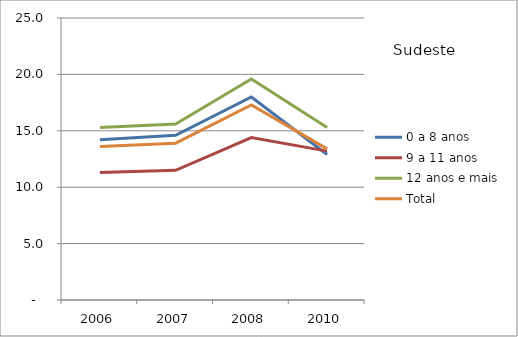
| Category | 0 a 8 anos | 9 a 11 anos | 12 anos e mais | Total |
|---|---|---|---|---|
| 2006.0 | 14.2 | 11.3 | 15.3 | 13.6 |
| 2007.0 | 14.6 | 11.5 | 15.6 | 13.9 |
| 2008.0 | 18 | 14.4 | 19.6 | 17.3 |
| 2010.0 | 12.9 | 13.2 | 15.3 | 13.4 |